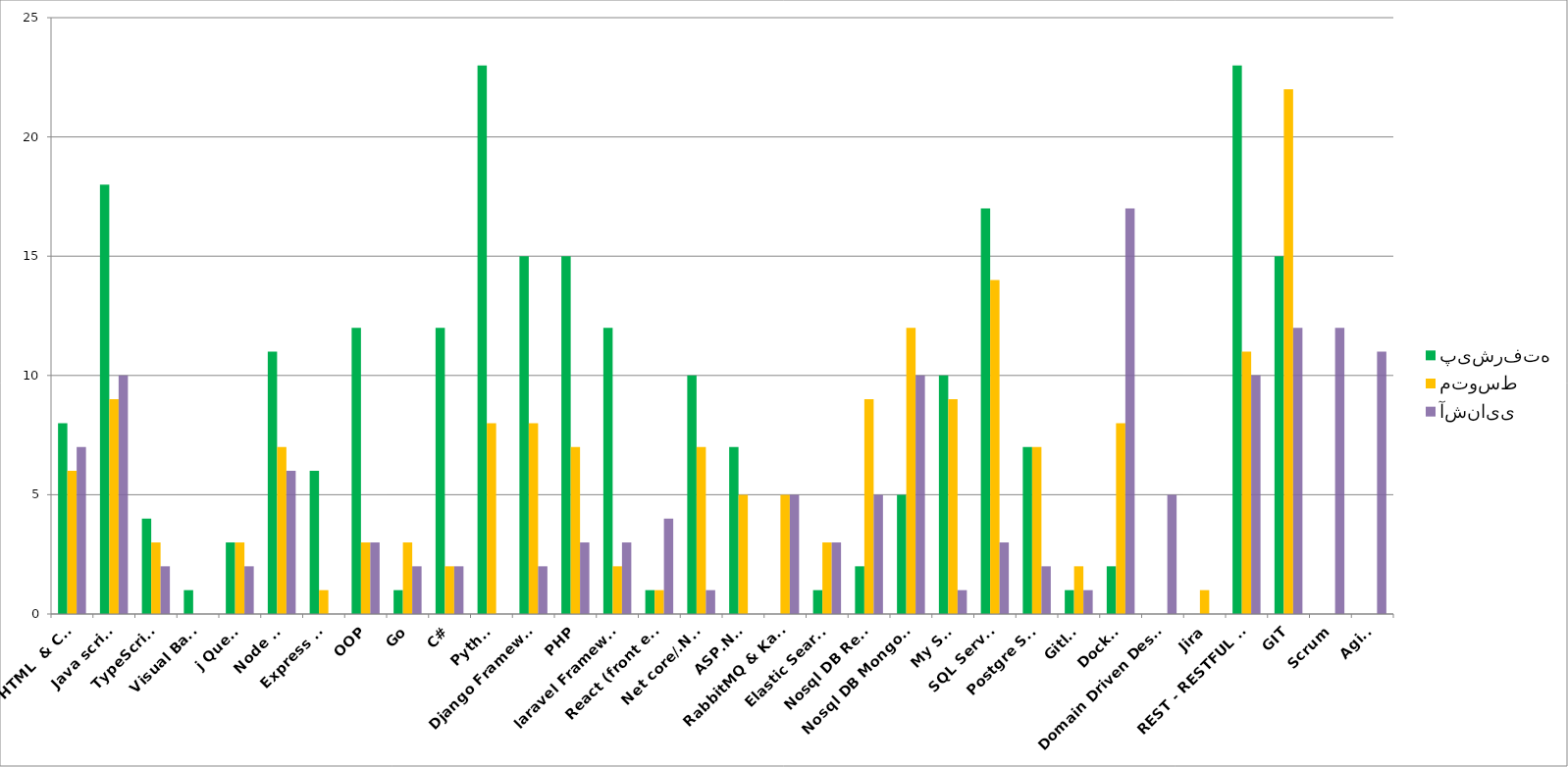
| Category | پیشرفته | متوسط | آشنایی |
|---|---|---|---|
| HTML  & CSS | 8 | 6 | 7 |
| Java script | 18 | 9 | 10 |
| TypeScript | 4 | 3 | 2 |
| Visual Basic | 1 | 0 | 0 |
| j Query | 3 | 3 | 2 |
| Node JS | 11 | 7 | 6 |
| Express JS | 6 | 1 | 0 |
| OOP | 12 | 3 | 3 |
| Go | 1 | 3 | 2 |
| C# | 12 | 2 | 2 |
| Python | 23 | 8 | 0 |
| Django Framework | 15 | 8 | 2 |
| PHP | 15 | 7 | 3 |
| laravel Framework | 12 | 2 | 3 |
| React (front end) | 1 | 1 | 4 |
| Net core/.Net. | 10 | 7 | 1 |
| ASP.Net  | 7 | 5 | 0 |
| RabbitMQ & Kafka | 0 | 5 | 5 |
| Elastic Search | 1 | 3 | 3 |
| Nosql DB Redis | 2 | 9 | 5 |
| Nosql DB MongoDB | 5 | 12 | 10 |
| My SQL | 10 | 9 | 1 |
| SQL Server | 17 | 14 | 3 |
| Postgre SQL | 7 | 7 | 2 |
| Gitlab | 1 | 2 | 1 |
| Docker | 2 | 8 | 17 |
| Domain Driven Design | 0 | 0 | 5 |
| Jira | 0 | 1 | 0 |
|  REST - RESTFUL API | 23 | 11 | 10 |
| GIT | 15 | 22 | 12 |
| Scrum | 0 | 0 | 12 |
| Agile | 0 | 0 | 11 |